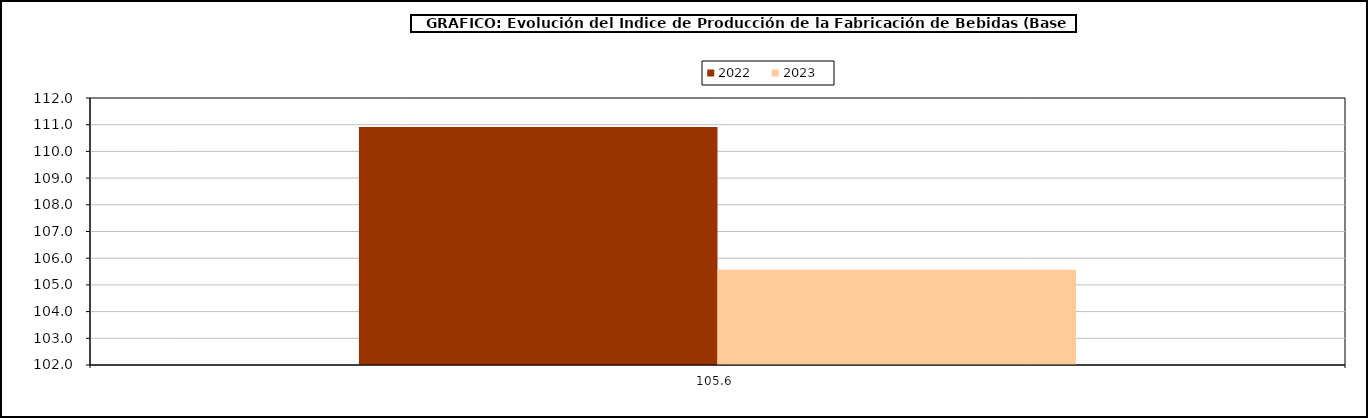
| Category | 2022 | 2023 |
|---|---|---|
| 105.56433333333335 | 110.912 | 105.564 |